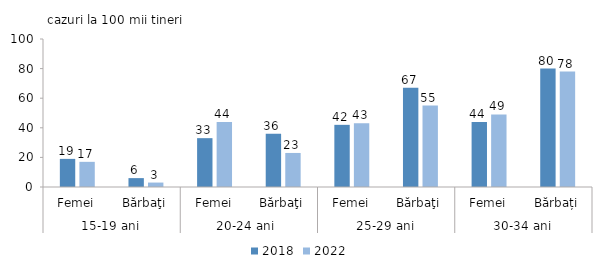
| Category | 2018 | 2022 |
|---|---|---|
| 0 | 19 | 17 |
| 1 | 6 | 3 |
| 2 | 33 | 44 |
| 3 | 36 | 23 |
| 4 | 42 | 43 |
| 5 | 67 | 55 |
| 6 | 44 | 49 |
| 7 | 80 | 78 |